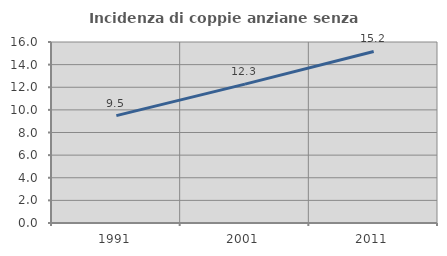
| Category | Incidenza di coppie anziane senza figli  |
|---|---|
| 1991.0 | 9.493 |
| 2001.0 | 12.277 |
| 2011.0 | 15.165 |